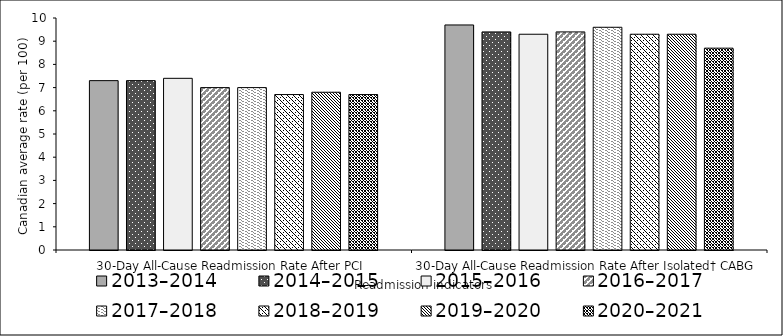
| Category | 2013–2014 | 2014–2015 | 2015–2016 | 2016–2017 | 2017–2018 | 2018–2019 | 2019–2020 | 2020–2021 |
|---|---|---|---|---|---|---|---|---|
| 30-Day All-Cause Readmission Rate After PCI | 7.3 | 7.3 | 7.4 | 7 | 7 | 6.7 | 6.8 | 6.7 |
| 30-Day All-Cause Readmission Rate After Isolated† CABG | 9.7 | 9.4 | 9.3 | 9.4 | 9.6 | 9.3 | 9.3 | 8.7 |